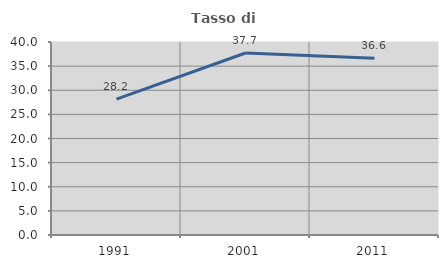
| Category | Tasso di occupazione   |
|---|---|
| 1991.0 | 28.164 |
| 2001.0 | 37.725 |
| 2011.0 | 36.62 |